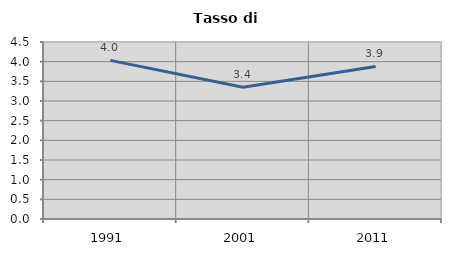
| Category | Tasso di disoccupazione   |
|---|---|
| 1991.0 | 4.032 |
| 2001.0 | 3.352 |
| 2011.0 | 3.879 |